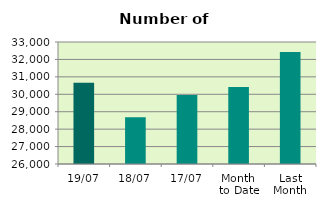
| Category | Series 0 |
|---|---|
| 19/07 | 30668 |
| 18/07 | 28678 |
| 17/07 | 29966 |
| Month 
to Date | 30418.933 |
| Last
Month | 32421.5 |